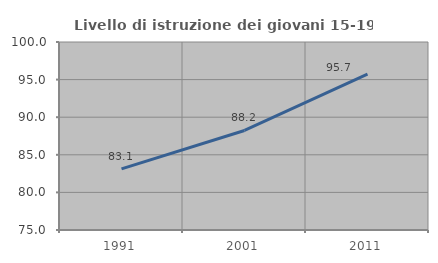
| Category | Livello di istruzione dei giovani 15-19 anni |
|---|---|
| 1991.0 | 83.133 |
| 2001.0 | 88.235 |
| 2011.0 | 95.714 |